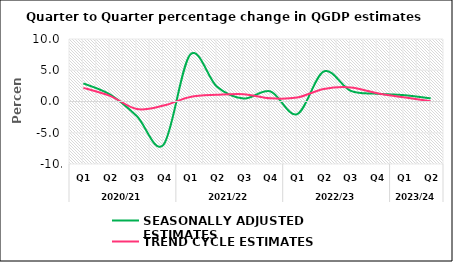
| Category | SEASONALLY ADJUSTED ESTIMATES | TREND CYCLE ESTIMATES |
|---|---|---|
| 0 | 2.895 | 2.185 |
| 1 | 1.115 | 0.904 |
| 2 | -2.327 | -1.206 |
| 3 | -6.924 | -0.651 |
| 4 | 7.506 | 0.736 |
| 5 | 2.373 | 1.07 |
| 6 | 0.476 | 1.178 |
| 7 | 1.617 | 0.503 |
| 8 | -2.032 | 0.623 |
| 9 | 4.807 | 2 |
| 10 | 1.72 | 2.257 |
| 11 | 1.24 | 1.333 |
| 12 | 1.017 | 0.665 |
| 13 | 0.499 | 0.054 |